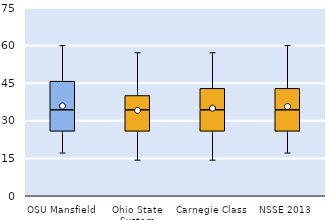
| Category | 25th | 50th | 75th |
|---|---|---|---|
| OSU Mansfield | 25.714 | 8.571 | 11.429 |
| Ohio State System | 25.714 | 8.571 | 5.714 |
| Carnegie Class | 25.714 | 8.571 | 8.571 |
| NSSE 2013 | 25.714 | 8.571 | 8.571 |